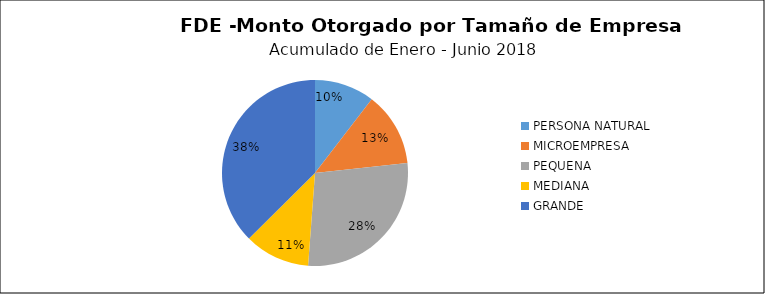
| Category | Monto | Créditos |
|---|---|---|
| PERSONA NATURAL | 0.808 | 73 |
| MICROEMPRESA | 0.995 | 32 |
| PEQUENA | 2.161 | 14 |
| MEDIANA | 0.881 | 6 |
| GRANDE | 2.9 | 3 |